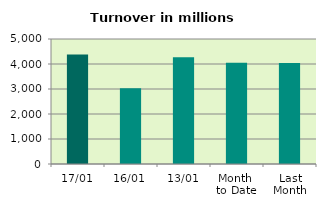
| Category | Series 0 |
|---|---|
| 17/01 | 4376.821 |
| 16/01 | 3031.678 |
| 13/01 | 4273.692 |
| Month 
to Date | 4049.622 |
| Last
Month | 4039.067 |